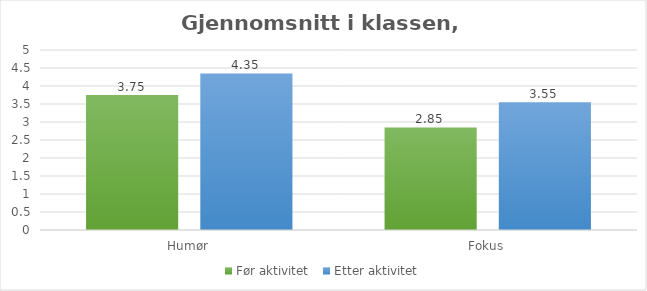
| Category | Før aktivitet  | Etter aktivitet |
|---|---|---|
| Humør | 3.75 | 4.35 |
| Fokus | 2.85 | 3.55 |